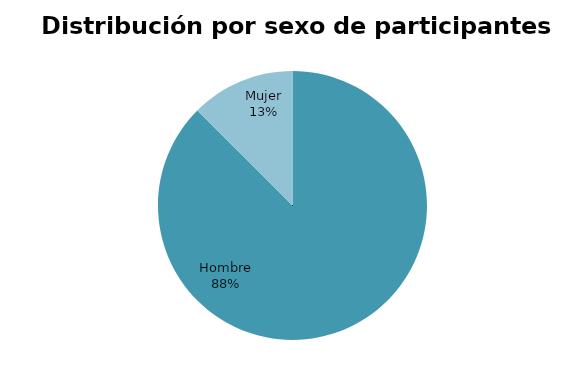
| Category | Series 0 |
|---|---|
| Hombre | 14 |
| Mujer | 2 |